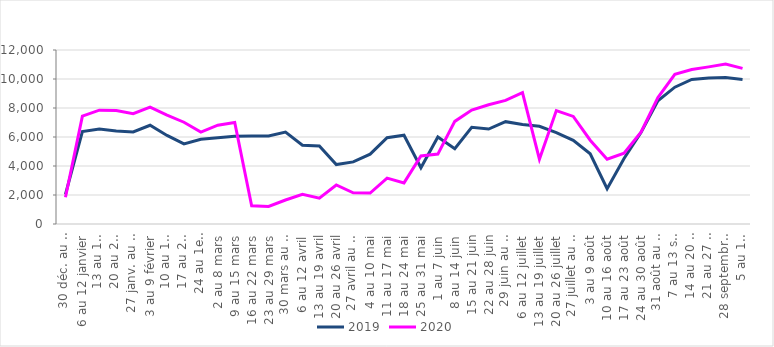
| Category | 2019 | 2020 |
|---|---|---|
| 30 déc. au 5 janvier | 2040 | 1844 |
| 6 au 12 janvier | 6370 | 7438 |
| 13 au 19 janvier | 6554 | 7852 |
| 20 au 26 janvier | 6407 | 7824 |
| 27 janv. au 2 février | 6351 | 7602 |
| 3 au 9 février | 6808 | 8056 |
| 10 au 16 février | 6108 | 7513 |
| 17 au 23 février | 5521 | 7018 |
| 24 au 1er mars | 5849 | 6339 |
| 2 au 8 mars | 5944 | 6815 |
| 9 au 15 mars | 6046 | 6998 |
| 16 au 22 mars | 6069 | 1260 |
| 23 au 29 mars | 6072 | 1215 |
| 30 mars au 5 avril | 6339 | 1653 |
| 6 au 12 avril | 5437 | 2049 |
| 13 au 19 avril | 5376 | 1786 |
| 20 au 26 avril | 4100 | 2689 |
| 27 avril au 3 mai | 4284 | 2149 |
| 4 au 10 mai | 4818 | 2130 |
| 11 au 17 mai | 5953 | 3161 |
| 18 au 24 mai | 6120 | 2834 |
| 25 au 31 mai | 3877 | 4689 |
| 1 au 7 juin | 5999 | 4822 |
| 8 au 14 juin | 5197 | 7076 |
| 15 au 21 juin | 6668 | 7855 |
| 22 au 28 juin | 6548 | 8226 |
| 29 juin au 5 juillet | 7057 | 8525 |
| 6 au 12 juillet | 6862 | 9056 |
| 13 au 19 juillet | 6737 | 4469 |
| 20 au 26 juillet | 6309 | 7821 |
| 27 juillet au 2 août | 5772 | 7417 |
| 3 au 9 août | 4840 | 5780 |
| 10 au 16 août | 2432 | 4473 |
| 17 au 23 août | 4517 | 4883 |
| 24 au 30 août | 6304 | 6333 |
| 31 août au 6 septembre | 8500 | 8722 |
| 7 au 13 septembre | 9436 | 10323 |
| 14 au 20 septembre | 9967 | 10652 |
| 21 au 27 septembre | 10067 | 10837 |
|  28 septembre au 4 octobre | 10096 | 11031 |
| 5 au 11 octobre | 9971 | 10731 |